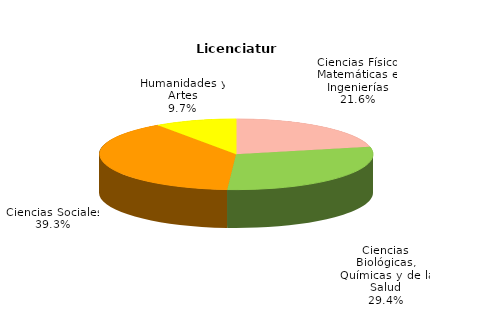
| Category | Series 0 |
|---|---|
| Ciencias Físico Matemáticas e Ingenierías | 46925 |
| Ciencias Biológicas, Químicas y de la Salud | 63982 |
| Ciencias Sociales | 85476 |
| Humanidades y Artes | 21013 |